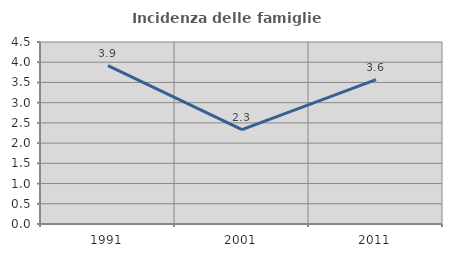
| Category | Incidenza delle famiglie numerose |
|---|---|
| 1991.0 | 3.914 |
| 2001.0 | 2.336 |
| 2011.0 | 3.568 |